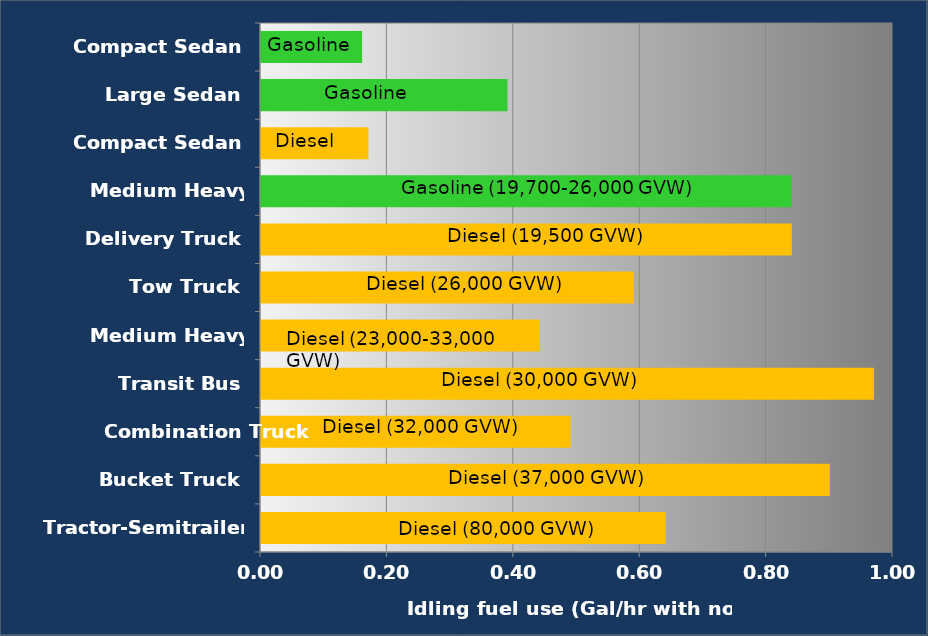
| Category | Idling fuel use (Gal/hr with no load) |
|---|---|
| Tractor-Semitrailer | 0.64 |
| Bucket Truck | 0.9 |
| Combination Truck | 0.49 |
| Transit Bus | 0.97 |
| Medium Heavy Truck | 0.44 |
| Tow Truck | 0.59 |
| Delivery Truck | 0.84 |
| Medium Heavy Truck | 0.84 |
| Compact Sedan | 0.17 |
| Large Sedan | 0.39 |
| Compact Sedan | 0.16 |